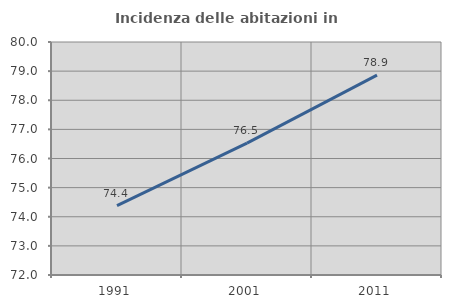
| Category | Incidenza delle abitazioni in proprietà  |
|---|---|
| 1991.0 | 74.385 |
| 2001.0 | 76.529 |
| 2011.0 | 78.865 |